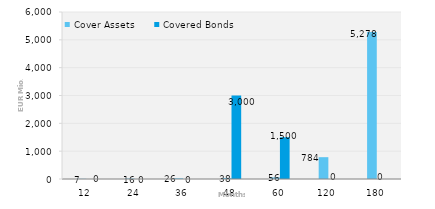
| Category | Cover Assets | Covered Bonds |
|---|---|---|
| 12.0 | 7.022 | 0 |
| 24.0 | 15.713 | 0 |
| 36.0 | 25.744 | 0 |
| 48.0 | 37.512 | 3000 |
| 60.0 | 56.083 | 1500 |
| 120.0 | 784.04 | 0 |
| 180.0 | 5277.709 | 0 |